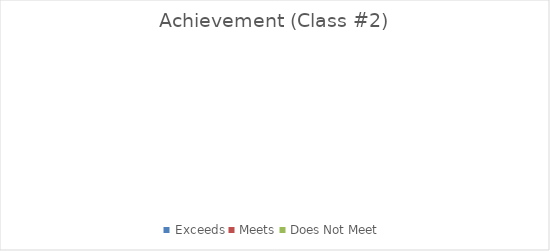
| Category | Series 0 |
|---|---|
| Exceeds | 0 |
| Meets | 0 |
| Does Not Meet | 0 |